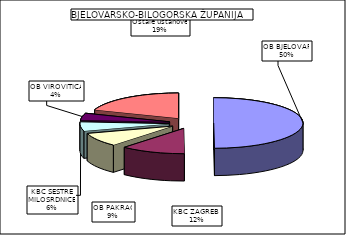
| Category | Series 0 |
|---|---|
| OB BJELOVAR | 49.864 |
| KBC ZAGREB  | 11.699 |
| OB PAKRAC | 8.754 |
| KBC SESTRE MILOSRDNICE | 5.832 |
| OB VIROVITICA | 4.366 |
| Ostale ustanove | 19.485 |